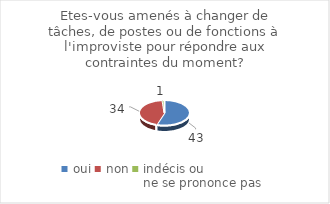
| Category | Etes-vous amenés à changer de tâches, de postes ou de fonctions à l'improviste pour répondre aux contraintes du moment? |
|---|---|
| oui | 43 |
| non | 34 |
| indécis ou 
ne se prononce pas | 1 |